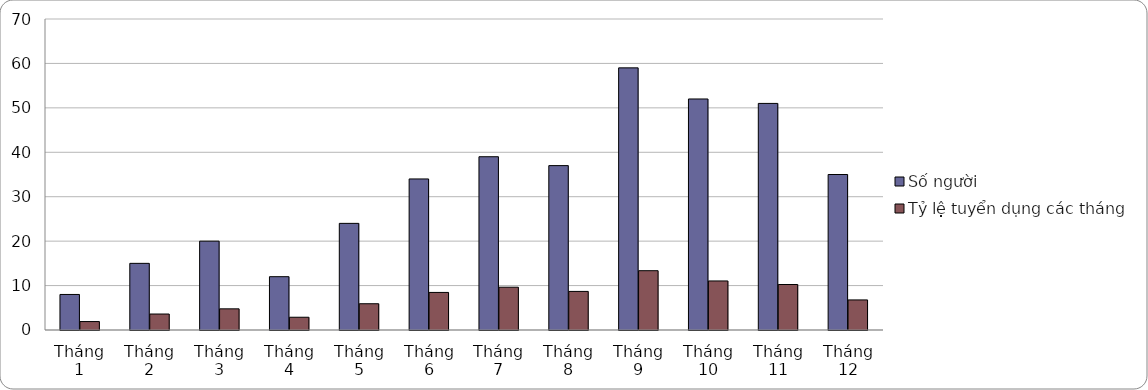
| Category | Số người | Tỷ lệ tuyển dụng các tháng |
|---|---|---|
| Tháng 1 | 8 | 1.9 |
| Tháng 2 | 15 | 3.597 |
| Tháng 3 | 20 | 4.762 |
| Tháng 4 | 12 | 2.871 |
| Tháng 5 | 24 | 5.911 |
| Tháng 6 | 34 | 8.458 |
| Tháng 7 | 39 | 9.63 |
| Tháng 8 | 37 | 8.685 |
| Tháng 9 | 59 | 13.348 |
| Tháng 10 | 52 | 11.04 |
| Tháng 11 | 51 | 10.241 |
| Tháng 12 | 35 | 6.77 |